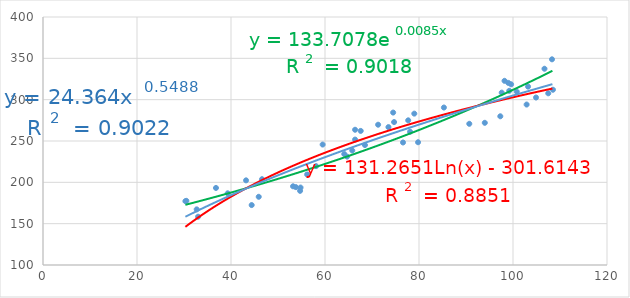
| Category | Series 0 |
|---|---|
| 66.4 | 251.7 |
| 53.2 | 195.2 |
| 90.7 | 270.8 |
| 108.5 | 312 |
| 30.3 | 177.2 |
| 64.1 | 234.2 |
| 71.3 | 269.7 |
| 33.0 | 158.4 |
| 65.8 | 238.5 |
| 85.3 | 290.5 |
| 107.5 | 307.7 |
| 74.7 | 272.9 |
| 74.5 | 284.4 |
| 97.3 | 279.9 |
| 76.6 | 248.2 |
| 94.0 | 272 |
| 104.9 | 302.6 |
| 97.6 | 308.5 |
| 99.0 | 320.3 |
| 32.7 | 167.3 |
| 44.4 | 172.5 |
| 56.2 | 209.5 |
| 77.7 | 275 |
| 54.8 | 193.7 |
| 106.7 | 337.4 |
| 73.5 | 266.8 |
| 53.8 | 194.2 |
| 66.4 | 263.6 |
| 98.2 | 322.8 |
| 58.1 | 219.6 |
| 36.8 | 193.2 |
| 43.2 | 202.4 |
| 64.7 | 231.1 |
| 79.8 | 248.5 |
| 100.8 | 309.6 |
| 59.5 | 245.7 |
| 103.2 | 315.8 |
| 30.5 | 177.6 |
| 99.6 | 318.6 |
| 79.0 | 283.1 |
| 45.9 | 182.5 |
| 68.5 | 245.1 |
| 102.9 | 294.1 |
| 78.1 | 261.2 |
| 67.6 | 262.2 |
| 99.2 | 310.7 |
| 39.3 | 186.7 |
| 54.7 | 189.7 |
| 108.3 | 348.8 |
| 46.6 | 203.8 |